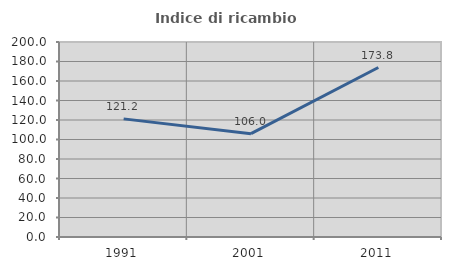
| Category | Indice di ricambio occupazionale  |
|---|---|
| 1991.0 | 121.154 |
| 2001.0 | 106 |
| 2011.0 | 173.81 |